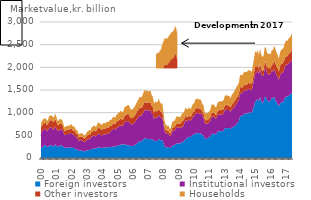
| Category | Foreign investors  | Institutional investors  | Other investors  | Households |
|---|---|---|---|---|
| 00 | 217.932 | 343.993 | 120.156 | 95.751 |
| 00 | 235.951 | 353.024 | 125.065 | 96.633 |
| 00 | 255.099 | 377.613 | 132.6 | 101.274 |
| 00 | 283.57 | 355.026 | 129.533 | 96.445 |
| 00 | 285.717 | 368.469 | 131.941 | 96.761 |
| 00 | 240.275 | 348.061 | 138.78 | 91.432 |
| 00 | 248.499 | 365.786 | 135.784 | 94.094 |
| 00 | 271.533 | 402.479 | 152.591 | 102.132 |
| 00 | 279.541 | 396.36 | 155.119 | 101.941 |
| 00 | 278.909 | 401.17 | 154.937 | 105.354 |
| 00 | 259.425 | 372.982 | 174.238 | 101.647 |
| 00 | 255.41 | 363.754 | 171.894 | 98.533 |
| 01 | 300.654 | 398.717 | 175.138 | 107.512 |
| 01 | 262.552 | 383.302 | 166.993 | 102.939 |
| 01 | 252.887 | 351.118 | 124.328 | 96.279 |
| 01 | 257.005 | 344.263 | 122.759 | 98.718 |
| 01 | 275.994 | 359.106 | 134.365 | 100.757 |
| 01 | 274.706 | 353.047 | 124.204 | 99.211 |
| 01 | 269.398 | 357.292 | 116.872 | 97.069 |
| 01 | 240.81 | 327.882 | 98.108 | 88.349 |
| 01 | 224.249 | 276.461 | 90.109 | 81.151 |
| 01 | 224.221 | 293.056 | 92.023 | 84.387 |
| 01 | 230.034 | 299.498 | 93.996 | 85.481 |
| 01 | 231.467 | 299.69 | 94.344 | 86.637 |
| 02 | 224.163 | 301.154 | 95.766 | 87.303 |
| 02 | 231.63 | 314.998 | 98.07 | 90.077 |
| 02 | 240.617 | 312.31 | 99.14 | 91.441 |
| 02 | 218.78 | 294.41 | 94.519 | 88.278 |
| 02 | 220.539 | 292.066 | 97.049 | 89.224 |
| 02 | 204.685 | 284.563 | 92.019 | 85.512 |
| 02 | 189.435 | 259.363 | 84.401 | 76.987 |
| 02 | 183.16 | 261.985 | 86.17 | 79.17 |
| 02 | 155.136 | 222.071 | 76.252 | 70.598 |
| 02 | 160.534 | 227.795 | 81.436 | 71.718 |
| 02 | 169.807 | 222.684 | 83.7 | 72.514 |
| 02 | 162.632 | 227.109 | 83.613 | 73.769 |
| 03 | 154.966 | 212.61 | 80.578 | 71.074 |
| 03 | 145.506 | 202.126 | 78.707 | 69.005 |
| 03 | 153.607 | 211.7 | 83.835 | 72.993 |
| 03 | 168.888 | 236.745 | 91.34 | 80.129 |
| 03 | 170.707 | 239.039 | 97.719 | 83.114 |
| 03 | 176.89 | 252.576 | 102.967 | 88.342 |
| 03 | 175.391 | 247.216 | 96.196 | 88.715 |
| 03 | 199.335 | 281.884 | 105.43 | 98.134 |
| 03 | 199.553 | 276.855 | 106.664 | 97.925 |
| 03 | 212.228 | 296.6 | 114.342 | 104.902 |
| 03 | 205.954 | 270.83 | 111.812 | 101.447 |
| 03 | 209.167 | 269.34 | 115.474 | 103.574 |
| 04 | 227.156 | 293.434 | 126.001 | 112.167 |
| 04 | 239.311 | 308.344 | 131.99 | 116.256 |
| 04 | 225.41 | 285.913 | 132.491 | 111.78 |
| 04 | 225.729 | 279.115 | 128.832 | 111.358 |
| 04 | 218.987 | 277.747 | 126.766 | 110.906 |
| 04 | 229.04 | 292.649 | 132.934 | 117.177 |
| 04 | 228.431 | 290.789 | 131.302 | 117.354 |
| 04 | 231.592 | 286.935 | 132.83 | 118.241 |
| 04 | 240.125 | 305.812 | 139.164 | 123.685 |
| 04 | 233.781 | 293.327 | 137.198 | 121.434 |
| 04 | 245.927 | 304.575 | 146.671 | 129.148 |
| 04 | 244.187 | 353.046 | 109.775 | 130.598 |
| 05 | 237.611 | 361.454 | 113.961 | 136.782 |
| 05 | 251.877 | 386.833 | 119.367 | 142.268 |
| 05 | 259.892 | 387.087 | 120.207 | 143.866 |
| 05 | 252.67 | 374.038 | 119.17 | 140.652 |
| 05 | 258.021 | 394.009 | 146.666 | 148.433 |
| 05 | 269.161 | 403.547 | 143.655 | 159.228 |
| 05 | 276.787 | 412.073 | 142.487 | 167.128 |
| 05 | 289.427 | 425.415 | 140.309 | 168.816 |
| 05 | 300.033 | 422.513 | 145.452 | 173.866 |
| 05 | 294.142 | 405.284 | 144.534 | 167.47 |
| 05 | 298.832 | 432.805 | 129.95 | 170.849 |
| 05 | 299.519 | 490.474 | 150.508 | 186.383 |
| 06 | 306.196 | 487.643 | 149.831 | 190.757 |
| 06 | 272.054 | 539.981 | 149.718 | 192.739 |
| 06 | 281.642 | 535.238 | 158.52 | 196.619 |
| 06 | 282.312 | 503.893 | 160.216 | 205.39 |
| 06 | 263.785 | 479.323 | 143.54 | 193.193 |
| 06 | 265.106 | 476.637 | 136.793 | 191.254 |
| 06 | 265.268 | 482.127 | 138.375 | 193.493 |
| 06 | 279.521 | 494.007 | 143.375 | 201.997 |
| 06 | 288.301 | 510.963 | 148.807 | 208.524 |
| 06 | 308.528 | 532.078 | 156.416 | 212.834 |
| 06 | 332.536 | 545.409 | 164.589 | 218.157 |
| 06 | 354.93 | 554.662 | 169.296 | 226.729 |
| 07 | 364.892 | 578.111 | 176.504 | 237.598 |
| 07 | 364.332 | 564.394 | 173.292 | 230.676 |
| 07 | 381.691 | 574.15 | 173.102 | 242.007 |
| 07 | 410.313 | 601.572 | 175.508 | 255.123 |
| 07 | 435.02 | 627.401 | 180.648 | 263.972 |
| 07 | 430.421 | 615.728 | 168.499 | 253.378 |
| 07 | 420.255 | 638.641 | 174.233 | 259.796 |
| 07 | 413.529 | 625.142 | 175.125 | 257.781 |
| 07 | 419.894 | 629.427 | 169.997 | 253.278 |
| 07 | 423.677 | 634.182 | 175.701 | 255.916 |
| 07 | 404.771 | 582.202 | 164.012 | 234.447 |
| 07 | 406.71 | 557.966 | 160.271 | 227.451 |
| 08 | 360.13 | 497.441 | 144.326 | 195.568 |
| 08 | 382.425 | 518.192 | 148.255 | 204.722 |
| 08 | 370.559 | 514.814 | 144.52 | 199.311 |
| 08 | 379.087 | 515.815 | 140.982 | 202.16 |
| 08 | 414.774 | 538.92 | 148.156 | 211.13 |
| 08 | 399.103 | 508.045 | 130.517 | 192.449 |
| 08 | 387.859 | 490.744 | 128.633 | 186.572 |
| 08 | 400.175 | 493.115 | 128.876 | 186.293 |
| 08 | 327.569 | 419.804 | 108.618 | 156.952 |
| 08 | 255.287 | 335.389 | 87.749 | 128.283 |
| 08 | 239.106 | 306.479 | 77.334 | 116.632 |
| 08 | 231.318 | 294.96 | 70.181 | 108.991 |
| 09 | 244.979 | 296.264 | 70.135 | 115.999 |
| 09 | 226.407 | 276.127 | 61.817 | 105.867 |
| 09 | 216.423 | 259.137 | 60.386 | 102.984 |
| 09 | 254.55 | 305.114 | 72.992 | 123.685 |
| 09 | 278.345 | 326.905 | 79.796 | 133.688 |
| 09 | 280.207 | 316.779 | 76.366 | 133.064 |
| 09 | 296.576 | 331.125 | 82.137 | 142.379 |
| 09 | 315.227 | 351.244 | 91.478 | 156.452 |
| 09 | 325.883 | 358.206 | 82.023 | 156.987 |
| 09 | 318.452 | 350.564 | 79.659 | 150.993 |
| 09 | 319.484 | 355.134 | 78.712 | 149.926 |
| 09 | 333.493 | 320.792 | 123.886 | 156.364 |
| 10 | 352.551 | 342.139 | 130.48 | 165.175 |
| 10 | 359.95 | 340.421 | 129.343 | 164.004 |
| 10 | 392.777 | 399.783 | 92.478 | 174.074 |
| 10 | 421.266 | 417.995 | 98.236 | 183.911 |
| 10 | 440.297 | 362.659 | 92.264 | 172.562 |
| 10 | 459.152 | 368.227 | 92.088 | 170.899 |
| 10 | 471.226 | 380.375 | 90.102 | 178.861 |
| 10 | 455.903 | 356.008 | 88.945 | 168.422 |
| 10 | 487.585 | 372.816 | 92.653 | 178.123 |
| 10 | 514.187 | 400.198 | 97.114 | 182.329 |
| 10 | 517.548 | 403.588 | 98.661 | 186.167 |
| 10 | 541.049 | 434.826 | 113.454 | 198.546 |
| 11 | 538.316 | 445.046 | 112.402 | 200.34 |
| 11 | 554.829 | 446.378 | 114.906 | 200.084 |
| 11 | 545.771 | 426.917 | 114.198 | 196.299 |
| 11 | 548.746 | 431.958 | 120.551 | 198.016 |
| 11 | 532.717 | 452.353 | 92.22 | 190.657 |
| 11 | 506.865 | 422.359 | 86.226 | 177.014 |
| 11 | 497.656 | 405.139 | 88.065 | 174.459 |
| 11 | 424.997 | 350.334 | 77.723 | 152.009 |
| 11 | 418.746 | 335.488 | 77.689 | 148.544 |
| 11 | 432.398 | 323.161 | 79.581 | 153.361 |
| 11 | 448.362 | 323.222 | 81.135 | 154.507 |
| 11 | 465.395 | 328.393 | 81.053 | 154.686 |
| 12 | 481.708 | 350.614 | 88.98 | 165.329 |
| 12 | 536.636 | 379.675 | 95.605 | 180.99 |
| 12 | 527.634 | 374.005 | 90.972 | 177.596 |
| 12 | 540.75 | 378.302 | 84.877 | 181.646 |
| 12 | 520.058 | 348.365 | 80.764 | 170.595 |
| 12 | 532.933 | 349.163 | 83.247 | 171.395 |
| 12 | 580.974 | 372.509 | 89.45 | 182.512 |
| 12 | 587.215 | 366.329 | 96.575 | 184.882 |
| 12 | 592.041 | 375.089 | 98.628 | 188.505 |
| 12 | 588.954 | 366.275 | 104.48 | 186.267 |
| 12 | 592.819 | 374.449 | 100.93 | 188.93 |
| 12 | 600.721 | 377.209 | 100.589 | 192.181 |
| 13 | 655.273 | 398.213 | 105.166 | 204.258 |
| 13 | 662.555 | 407.49 | 108.052 | 208.893 |
| 13 | 653.522 | 405.413 | 110.358 | 210.299 |
| 13 | 661.244 | 396.287 | 98.683 | 210.336 |
| 13 | 659.235 | 396.134 | 103.106 | 214.588 |
| 13 | 632.287 | 380.571 | 97.949 | 205.148 |
| 13 | 670.618 | 404.255 | 104.936 | 217.775 |
| 13 | 679.084 | 415.102 | 109.673 | 219.921 |
| 13 | 695.279 | 426.279 | 119.656 | 226.555 |
| 13 | 715.679 | 440.202 | 121.878 | 233.784 |
| 13 | 750.223 | 457.468 | 117.561 | 241.539 |
| 13 | 770.953 | 474.349 | 118.771 | 244.236 |
| 14 | 813.78 | 471.514 | 121.861 | 253.1 |
| 14 | 914.446 | 502.269 | 137.187 | 274.649 |
| 14 | 932.436 | 496.393 | 139.45 | 270.933 |
| 14 | 932.818 | 500.595 | 115.821 | 272.926 |
| 14 | 951.629 | 520.84 | 120.673 | 283.724 |
| 14 | 986.529 | 515.509 | 121.861 | 282.97 |
| 14 | 980.214 | 508.745 | 124.714 | 278.978 |
| 14 | 977.678 | 517.242 | 126.768 | 278.844 |
| 14 | 1009.214 | 521.383 | 128.913 | 281.707 |
| 14 | 997.096 | 517.872 | 133.06 | 280.327 |
| 14 | 1007.644 | 502.533 | 136.082 | 278.014 |
| 14 | 989.086 | 496.41 | 136.868 | 276.122 |
| 15 | 1073.196 | 539.64 | 144.211 | 297.484 |
| 15 | 1157.317 | 587.209 | 154.951 | 313.794 |
| 15 | 1256.127 | 607.934 | 165.828 | 330.772 |
| 15 | 1263.324 | 619.499 | 120.71 | 317.034 |
| 15 | 1301.391 | 628.018 | 121.434 | 326.418 |
| 15 | 1250.277 | 599.694 | 113.704 | 308.93 |
| 15 | 1340.344 | 619.027 | 125.22 | 328.05 |
| 15 | 1248.663 | 608.873 | 114.138 | 313.406 |
| 15 | 1218.478 | 585.66 | 115.168 | 307.732 |
| 15 | 1239.905 | 587.42 | 120.765 | 312.788 |
| 15 | 1341.668 | 631.08 | 133.154 | 336.933 |
| 15 | 1348.62 | 617.098 | 135.068 | 334.237 |
| 16 | 1278.023 | 593.645 | 130.81 | 320.352 |
| 16 | 1247.483 | 595.574 | 135.223 | 314.762 |
| 16 | 1249.226 | 594.696 | 143.284 | 314.331 |
| 16 | 1267.428 | 593.686 | 115.582 | 315.069 |
| 16 | 1332.353 | 610.973 | 115.824 | 324.395 |
| 16 | 1306.717 | 591.807 | 168.03 | 311.449 |
| 16 | 1352.101 | 618.962 | 183.789 | 323.742 |
| 16 | 1273.58 | 623.489 | 186.507 | 319.792 |
| 16 | 1235.847 | 598.682 | 188.145 | 307.462 |
| 16 | 1184.909 | 601.318 | 191.386 | 296.448 |
| 16 | 1143.119 | 580.684 | 180.942 | 286.626 |
| 16 | 1198.308 | 631.256 | 200.531 | 302.764 |
| 17 | 1227.812 | 649.204 | 202.736 | 311.145 |
| 17 | 1237.274 | 645.94 | 203.754 | 313.16 |
| 17 | 1245.664 | 660.121 | 212.088 | 321.731 |
| 17 | 1315.707 | 687.393 | 188.323 | 337.571 |
| 17 | 1359.891 | 703.273 | 186.732 | 342.663 |
| 17 | 1350.849 | 700.537 | 187.975 | 339.617 |
| 17 | 1365.65 | 718.924 | 193.473 | 343.046 |
| 17 | 1393.758 | 716.776 | 204.266 | 346.509 |
| 17 | 1405.153 | 708.199 | 217.946 | 347.387 |
| 17 | 1442.125 | 728.647 | 223.539 | 356.364 |
| 17 | 1382.771 | 691.126 | 223.173 | 334.335 |